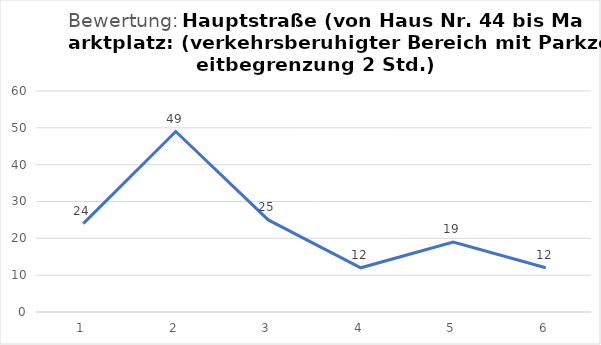
| Category | Series 0 |
|---|---|
| 1.0 | 24 |
| 2.0 | 49 |
| 3.0 | 25 |
| 4.0 | 12 |
| 5.0 | 19 |
| 6.0 | 12 |